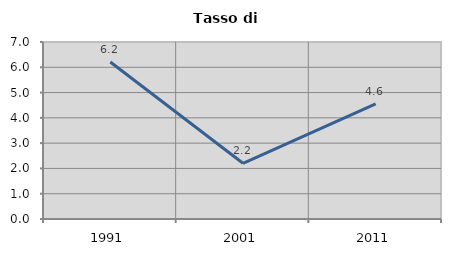
| Category | Tasso di disoccupazione   |
|---|---|
| 1991.0 | 6.207 |
| 2001.0 | 2.204 |
| 2011.0 | 4.555 |